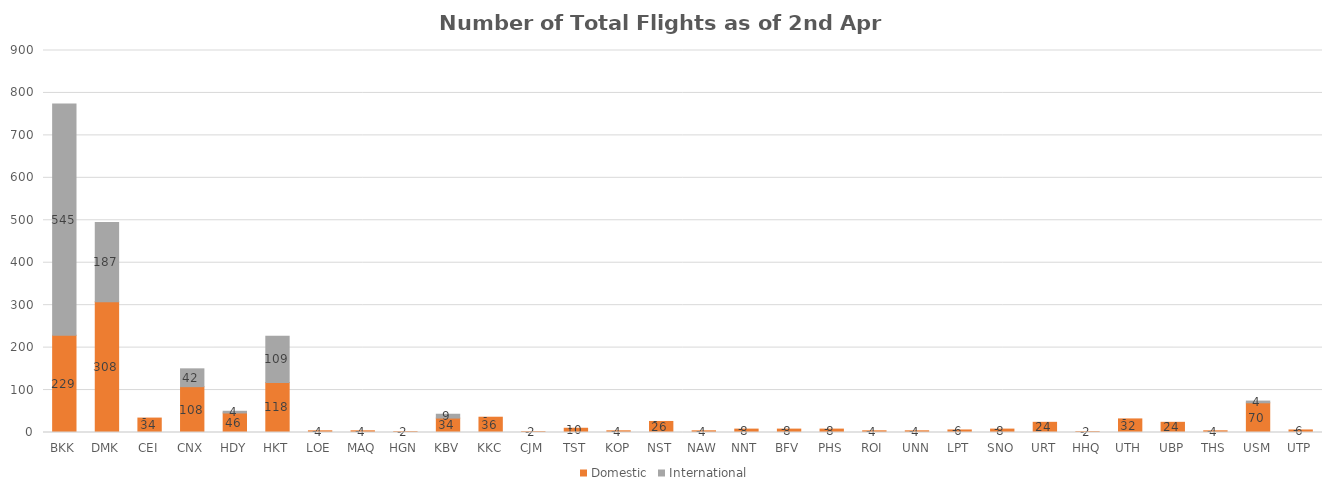
| Category | Domestic | International |
|---|---|---|
| BKK | 229 | 545 |
| DMK | 308 | 187 |
| CEI | 34 | 0 |
| CNX | 108 | 42 |
| HDY | 46 | 4 |
| HKT | 118 | 109 |
| LOE | 4 | 0 |
| MAQ | 4 | 0 |
| HGN | 2 | 0 |
| KBV | 34 | 9 |
| KKC | 36 | 0 |
| CJM | 2 | 0 |
| TST | 10 | 0 |
| KOP | 4 | 0 |
| NST | 26 | 0 |
| NAW | 4 | 0 |
| NNT | 8 | 0 |
| BFV | 8 | 0 |
| PHS | 8 | 0 |
| ROI | 4 | 0 |
| UNN | 4 | 0 |
| LPT | 6 | 0 |
| SNO | 8 | 0 |
| URT | 24 | 0 |
| HHQ | 2 | 0 |
| UTH | 32 | 0 |
| UBP | 24 | 0 |
| THS | 4 | 0 |
| USM | 70 | 4 |
| UTP | 6 | 0 |